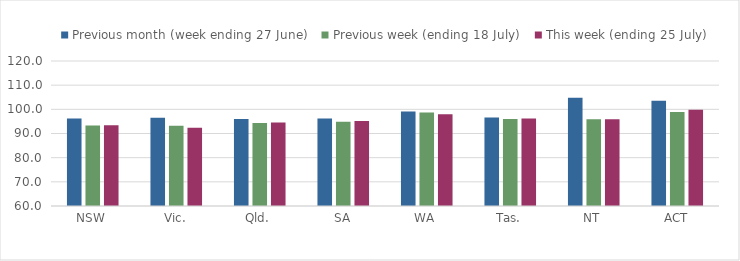
| Category | Previous month (week ending 27 June) | Previous week (ending 18 July) | This week (ending 25 July) |
|---|---|---|---|
| NSW | 96.238 | 93.295 | 93.369 |
| Vic. | 96.511 | 93.199 | 92.424 |
| Qld. | 96.025 | 94.366 | 94.525 |
| SA | 96.16 | 94.832 | 95.137 |
| WA | 99.139 | 98.687 | 97.999 |
| Tas. | 96.588 | 95.967 | 96.161 |
| NT | 104.828 | 95.934 | 95.934 |
| ACT | 103.596 | 98.914 | 99.861 |